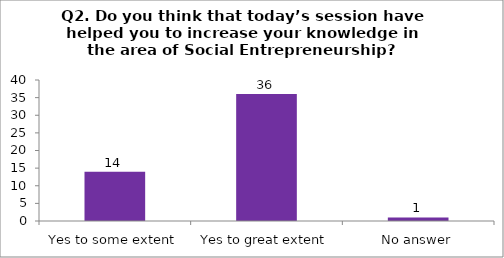
| Category | Q2. Do you think that today’s session have helped you to increase your knowledge in the area of Social Entrepreneurship? |
|---|---|
| Yes to some extent | 14 |
| Yes to great extent | 36 |
| No answer | 1 |